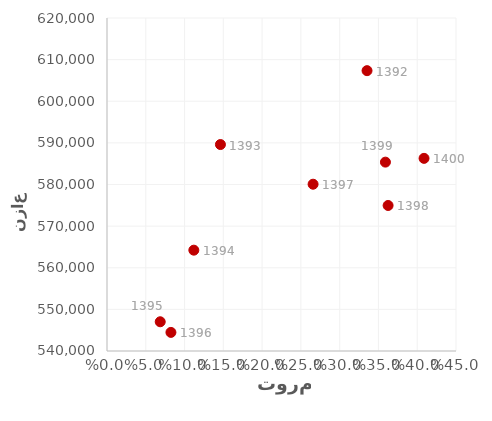
| Category | نزاع |
|---|---|
| 0.33528632043109274 | 607349 |
| 0.14625085674670926 | 589602 |
| 0.1119701864292478 | 564223 |
| 0.06860817256953808 | 547021 |
| 0.08242848284092517 | 544470 |
| 0.2657205868798125 | 580070 |
| 0.3624440671473396 | 574961 |
| 0.35900040743111394 | 585374 |
| 0.4087840122142776 | 586283 |